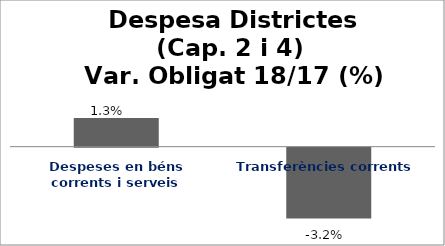
| Category | Series 0 |
|---|---|
| Despeses en béns corrents i serveis | 0.013 |
| Transferències corrents | -0.032 |